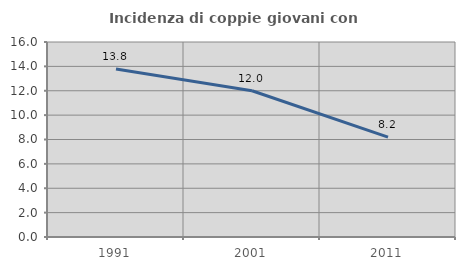
| Category | Incidenza di coppie giovani con figli |
|---|---|
| 1991.0 | 13.793 |
| 2001.0 | 12 |
| 2011.0 | 8.197 |